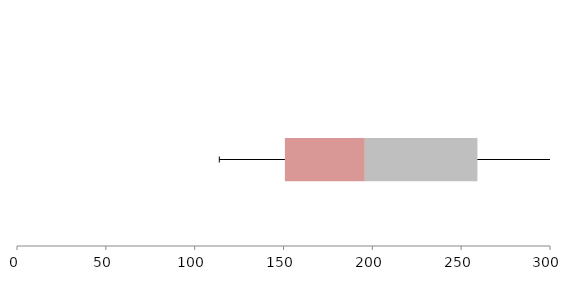
| Category | Series 1 | Series 2 | Series 3 |
|---|---|---|---|
| 0 | 150.779 | 45.005 | 63.357 |